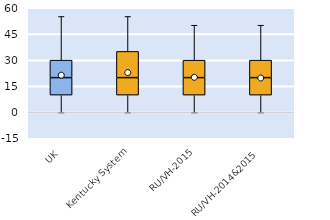
| Category | 25th | 50th | 75th |
|---|---|---|---|
| UK | 10 | 10 | 10 |
| Kentucky System | 10 | 10 | 15 |
| RU/VH-2015 | 10 | 10 | 10 |
| RU/VH-2014&2015 | 10 | 10 | 10 |